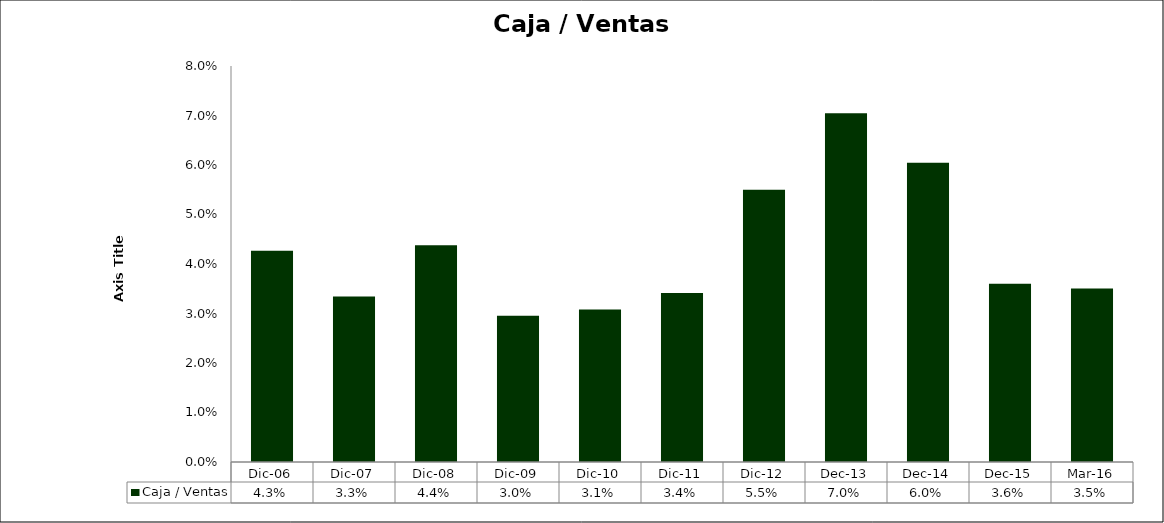
| Category | Caja / Ventas |
|---|---|
| Dic-06 | 0.043 |
| Dic-07 | 0.033 |
| Dic-08 | 0.044 |
| Dic-09 | 0.03 |
| Dic-10 | 0.031 |
| Dic-11 | 0.034 |
| Dic-12 | 0.055 |
| dic-13 | 0.07 |
| dic-14 | 0.06 |
| dic-15 | 0.036 |
| mar-16 | 0.035 |